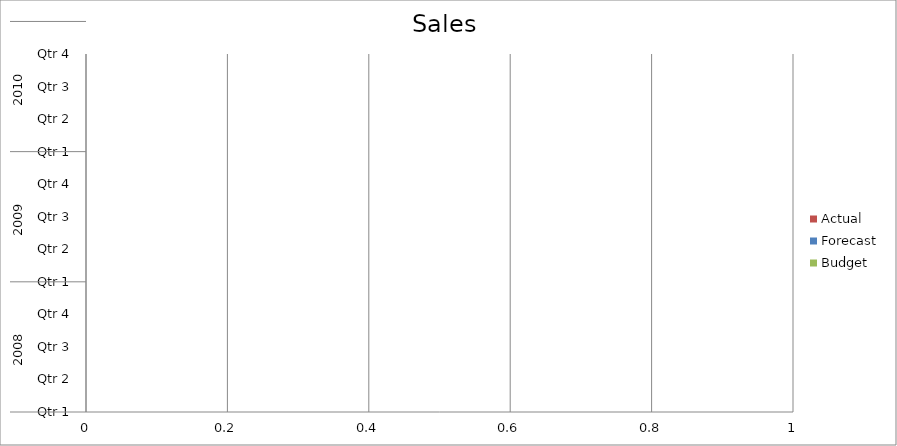
| Category | Budget | Forecast | Actual |
|---|---|---|---|
| 0 | 2780 | 950 | 1460 |
| 1 | 1620 | 2800 | 2430 |
| 2 | 740 | 2170 | 2720 |
| 3 | 3220 | 550 | 680 |
| 4 | 3150 | 3280 | 1040 |
| 5 | 1310 | 1850 | 1590 |
| 6 | 810 | 1520 | 2420 |
| 7 | 2080 | 1190 | 2210 |
| 8 | 1090 | 1760 | 1080 |
| 9 | 630 | 3430 | 2670 |
| 10 | 2930 | 1370 | 1940 |
| 11 | 750 | 2450 | 2680 |